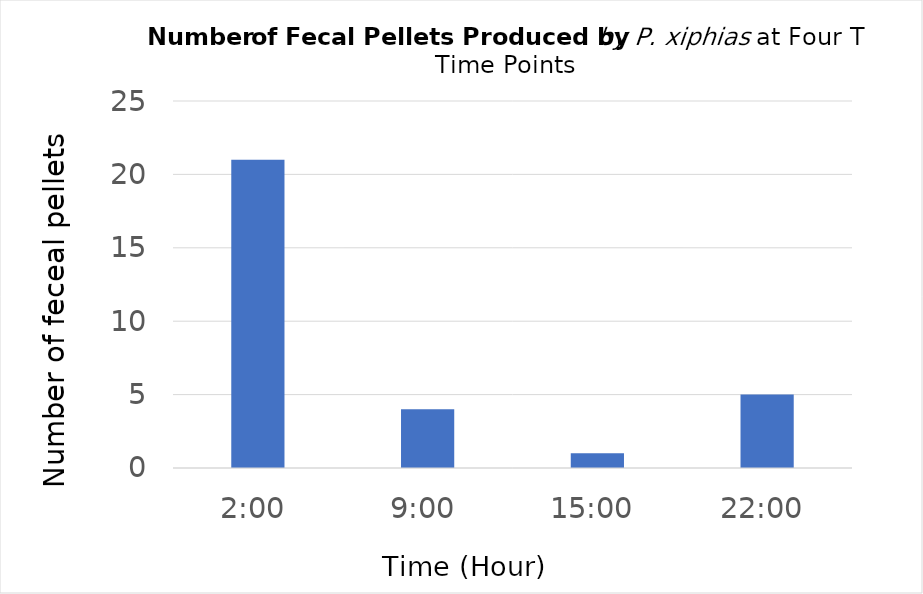
| Category | Series 0 |
|---|---|
| 0.08333333333333333 | 21 |
| 0.375 | 4 |
| 0.625 | 1 |
| 0.9166666666666666 | 5 |